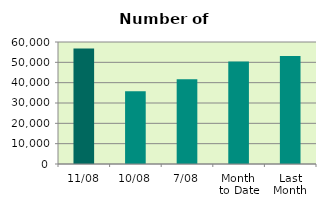
| Category | Series 0 |
|---|---|
| 11/08 | 56744 |
| 10/08 | 35840 |
| 7/08 | 41720 |
| Month 
to Date | 50380.286 |
| Last
Month | 53071.913 |